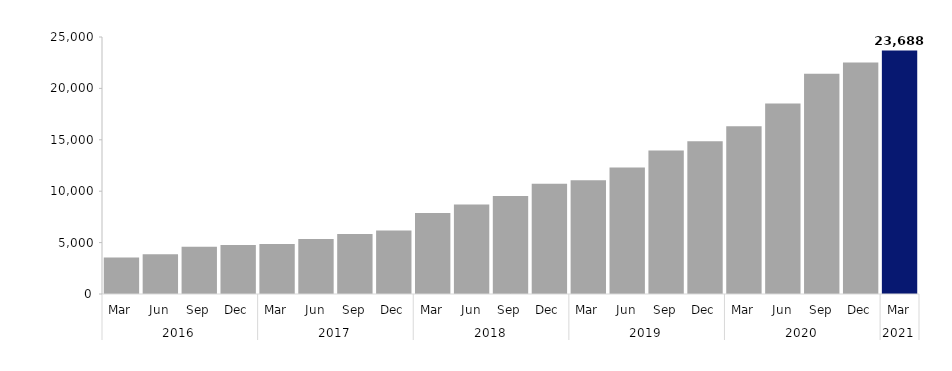
| Category | Series 0 |
|---|---|
| 0 | 3549 |
| 1 | 3876 |
| 2 | 4602 |
| 3 | 4773 |
| 4 | 4866 |
| 5 | 5352 |
| 6 | 5844 |
| 7 | 6180 |
| 8 | 7890 |
| 9 | 8703 |
| 10 | 9537 |
| 11 | 10713 |
| 12 | 11067 |
| 13 | 12309 |
| 14 | 13965 |
| 15 | 14868 |
| 16 | 16308 |
| 17 | 18522 |
| 18 | 21414 |
| 19 | 22521 |
| 20 | 23688 |